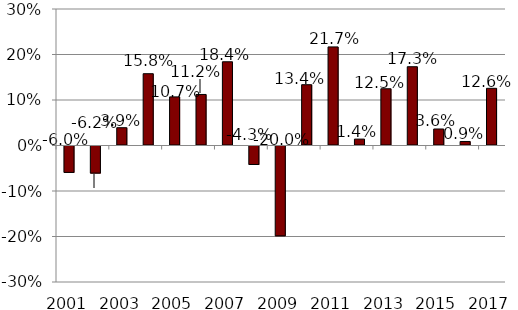
| Category | Series 0 |
|---|---|
| 2001.0 | -0.06 |
| 2002.0 | -0.062 |
| 2003.0 | 0.039 |
| 2004.0 | 0.158 |
| 2005.0 | 0.107 |
| 2006.0 | 0.112 |
| 2007.0 | 0.184 |
| 2008.0 | -0.043 |
| 2009.0 | -0.2 |
| 2010.0 | 0.134 |
| 2011.0 | 0.217 |
| 2012.0 | 0.014 |
| 2013.0 | 0.125 |
| 2014.0 | 0.173 |
| 2015.0 | 0.036 |
| 2016.0 | 0.009 |
| 2017.0 | 0.126 |